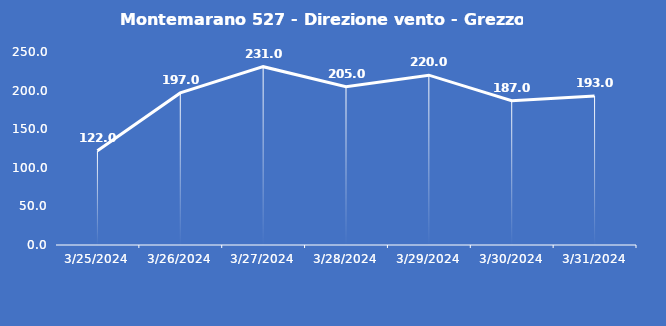
| Category | Montemarano 527 - Direzione vento - Grezzo (°N) |
|---|---|
| 3/25/24 | 122 |
| 3/26/24 | 197 |
| 3/27/24 | 231 |
| 3/28/24 | 205 |
| 3/29/24 | 220 |
| 3/30/24 | 187 |
| 3/31/24 | 193 |